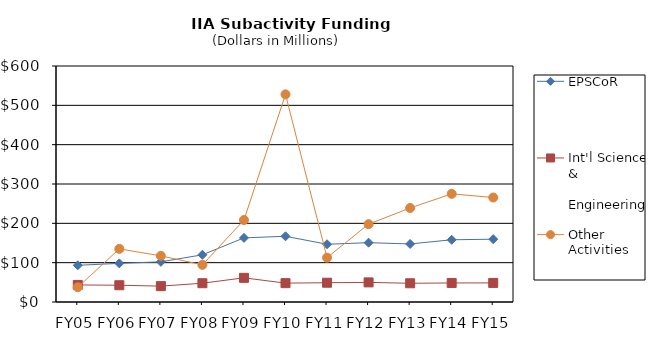
| Category | EPSCoR | Int'l Science &
   Engineering | Other Activities |
|---|---|---|---|
| FY05 | 93.35 | 43.38 | 37.57 |
| FY06 | 98.22 | 42.61 | 135.08 |
| FY07 | 102.11 | 40.36 | 117.34 |
| FY08 | 120 | 47.77 | 94.48 |
| FY09 | 163 | 61.43 | 208.43 |
| FY10 | 167.11 | 47.94 | 527.93 |
| FY11 | 146.82 | 49.03 | 112.78 |
| FY12 | 150.85 | 49.87 | 197.88 |
| FY13 | 147.6 | 47.628 | 239.054 |
| FY14 | 158.19 | 48.463 | 274.94 |
| FY15 | 159.69 | 48.52 | 265.65 |